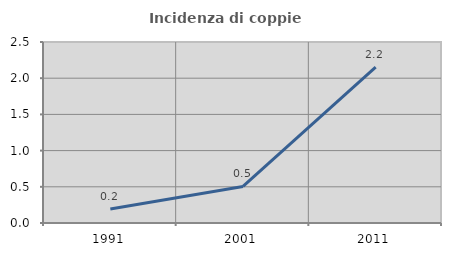
| Category | Incidenza di coppie miste |
|---|---|
| 1991.0 | 0.194 |
| 2001.0 | 0.504 |
| 2011.0 | 2.154 |